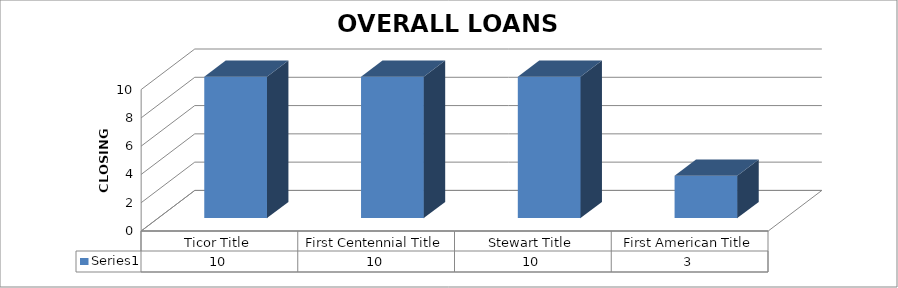
| Category | Series 0 |
|---|---|
| Ticor Title | 10 |
| First Centennial Title | 10 |
| Stewart Title | 10 |
| First American Title | 3 |